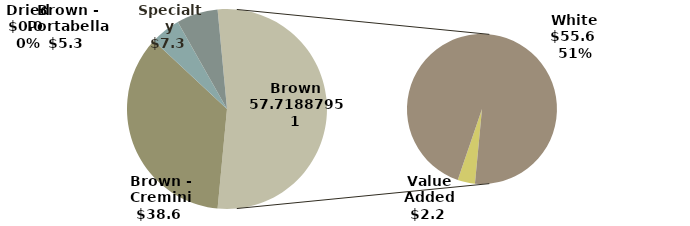
| Category | Brown |
|---|---|
| Brown - Cremini | 38.573 |
| Brown - Portabella | 5.308 |
| Dried | 0.008 |
| Specialty | 7.28 |
| Value Added | 2.16 |
| White | 55.559 |